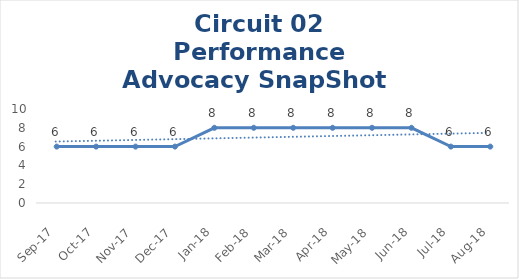
| Category | Circuit 02 |
|---|---|
| Sep-17 | 6 |
| Oct-17 | 6 |
| Nov-17 | 6 |
| Dec-17 | 6 |
| Jan-18 | 8 |
| Feb-18 | 8 |
| Mar-18 | 8 |
| Apr-18 | 8 |
| May-18 | 8 |
| Jun-18 | 8 |
| Jul-18 | 6 |
| Aug-18 | 6 |